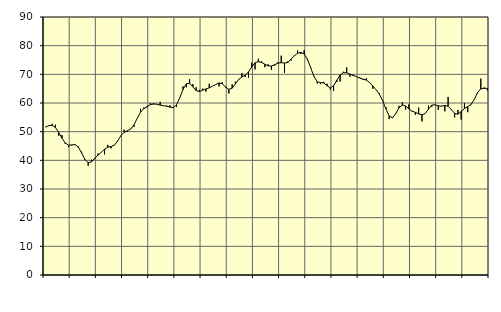
| Category | Piggar | Series 1 |
|---|---|---|
| nan | 51.7 | 51.6 |
| 87.0 | 52.3 | 52.12 |
| 87.0 | 52.7 | 52.24 |
| 87.0 | 52.4 | 51.45 |
| nan | 48.6 | 49.73 |
| 88.0 | 48.8 | 47.73 |
| 88.0 | 45.7 | 46.05 |
| 88.0 | 44.6 | 45.28 |
| nan | 45.2 | 45.38 |
| 89.0 | 45.6 | 45.51 |
| 89.0 | 44.8 | 44.62 |
| 89.0 | 43 | 42.55 |
| nan | 40.1 | 40.34 |
| 90.0 | 38.1 | 39.14 |
| 90.0 | 40.2 | 39.44 |
| 90.0 | 40.4 | 40.71 |
| nan | 42.4 | 41.83 |
| 91.0 | 42.8 | 42.77 |
| 91.0 | 42.1 | 43.85 |
| 91.0 | 45.4 | 44.57 |
| nan | 44.2 | 44.81 |
| 92.0 | 45.3 | 45.25 |
| 92.0 | 46.8 | 46.74 |
| 92.0 | 48.6 | 48.62 |
| nan | 50.7 | 49.78 |
| 93.0 | 50 | 50.34 |
| 93.0 | 51 | 50.9 |
| 93.0 | 51.7 | 52.35 |
| nan | 54.7 | 54.68 |
| 94.0 | 58 | 56.8 |
| 94.0 | 58.4 | 58 |
| 94.0 | 58.5 | 58.73 |
| nan | 60 | 59.42 |
| 95.0 | 59.4 | 59.73 |
| 95.0 | 59.5 | 59.58 |
| 95.0 | 60.4 | 59.25 |
| nan | 59.1 | 59.06 |
| 96.0 | 59.1 | 58.88 |
| 96.0 | 59.2 | 58.57 |
| 96.0 | 58.2 | 58.38 |
| nan | 58.6 | 59.33 |
| 97.0 | 61.9 | 61.85 |
| 97.0 | 65.8 | 64.73 |
| 97.0 | 65.5 | 66.73 |
| nan | 68.3 | 66.87 |
| 98.0 | 66.6 | 65.62 |
| 98.0 | 65.5 | 64.33 |
| 98.0 | 64.6 | 63.98 |
| nan | 65 | 64.5 |
| 99.0 | 64 | 64.89 |
| 99.0 | 66.7 | 65.29 |
| 99.0 | 65.9 | 65.87 |
| nan | 66.5 | 66.45 |
| 0.0 | 65.8 | 67 |
| 0.0 | 67.2 | 66.75 |
| 0.0 | 65.4 | 65.57 |
| nan | 63.3 | 64.75 |
| 1.0 | 66.5 | 65.16 |
| 1.0 | 67.4 | 66.67 |
| 1.0 | 68.1 | 68.26 |
| nan | 70.4 | 69.05 |
| 2.0 | 69.1 | 69.73 |
| 2.0 | 68.8 | 70.87 |
| 2.0 | 74.1 | 72.55 |
| nan | 71.7 | 74.05 |
| 3.0 | 75.4 | 74.39 |
| 3.0 | 74.6 | 74.16 |
| 3.0 | 72.5 | 73.52 |
| nan | 73.5 | 72.94 |
| 4.0 | 71.6 | 72.91 |
| 4.0 | 73 | 73.35 |
| 4.0 | 74.2 | 73.92 |
| nan | 76.5 | 74.06 |
| 5.0 | 70.5 | 73.91 |
| 5.0 | 74.5 | 74.17 |
| 5.0 | 74.8 | 75.28 |
| nan | 76.7 | 76.5 |
| 6.0 | 78.3 | 77.34 |
| 6.0 | 77.1 | 77.67 |
| 6.0 | 78.4 | 77.08 |
| nan | 74.9 | 75.3 |
| 7.0 | 72.5 | 72.3 |
| 7.0 | 69.4 | 69.25 |
| 7.0 | 66.8 | 67.43 |
| nan | 66.6 | 67.1 |
| 8.0 | 67.4 | 67.01 |
| 8.0 | 66.7 | 66.03 |
| 8.0 | 64.7 | 65.28 |
| nan | 64.2 | 66.02 |
| 9.0 | 67.3 | 67.95 |
| 9.0 | 67.5 | 69.74 |
| 9.0 | 70.9 | 70.59 |
| nan | 72.4 | 70.54 |
| 10.0 | 69.2 | 70.06 |
| 10.0 | 69.9 | 69.59 |
| 10.0 | 69.2 | 69.22 |
| nan | 68.9 | 68.71 |
| 11.0 | 68.1 | 68.33 |
| 11.0 | 68.6 | 67.97 |
| 11.0 | 67.2 | 67.13 |
| nan | 65 | 65.9 |
| 12.0 | 64.6 | 64.6 |
| 12.0 | 63.4 | 63.1 |
| 12.0 | 60.7 | 60.79 |
| nan | 58.5 | 57.91 |
| 13.0 | 54.4 | 55.47 |
| 13.0 | 55.1 | 54.82 |
| 13.0 | 56.2 | 56.31 |
| nan | 59 | 58.33 |
| 14.0 | 60.2 | 59.29 |
| 14.0 | 57.7 | 58.97 |
| 14.0 | 59.5 | 57.94 |
| nan | 57 | 57.15 |
| 15.0 | 55.9 | 56.73 |
| 15.0 | 58.4 | 56.2 |
| 15.0 | 53.6 | 55.89 |
| nan | 56.4 | 56.33 |
| 16.0 | 59.1 | 57.87 |
| 16.0 | 58.7 | 59.24 |
| 16.0 | 59.4 | 59.41 |
| nan | 57.6 | 59 |
| 17.0 | 59 | 58.88 |
| 17.0 | 57.1 | 59.16 |
| 17.0 | 62.1 | 58.84 |
| nan | 57.9 | 57.7 |
| 18.0 | 55 | 56.37 |
| 18.0 | 57.6 | 56.1 |
| 18.0 | 54.2 | 57.04 |
| nan | 60 | 58.05 |
| 19.0 | 56.8 | 58.74 |
| 19.0 | 59.6 | 59.48 |
| 19.0 | 61.2 | 61.24 |
| nan | 63.3 | 63.61 |
| 20.0 | 68.5 | 64.93 |
| 20.0 | 65.4 | 65.13 |
| 20.0 | 64.4 | 65.11 |